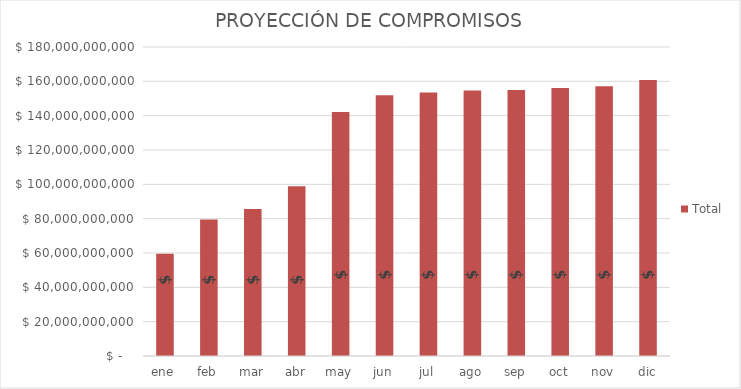
| Category | Total |
|---|---|
| ene | 59586408153.873 |
| feb | 79488524124.839 |
| mar | 85615774526.891 |
| abr | 98875162625.891 |
| may | 142131653848.475 |
| jun | 151942628292.787 |
| jul | 153560674001.787 |
| ago | 154656778561.787 |
| sep | 154884853185.843 |
| oct | 156177906885.843 |
| nov | 157118115902.843 |
| dic | 160756367645.372 |